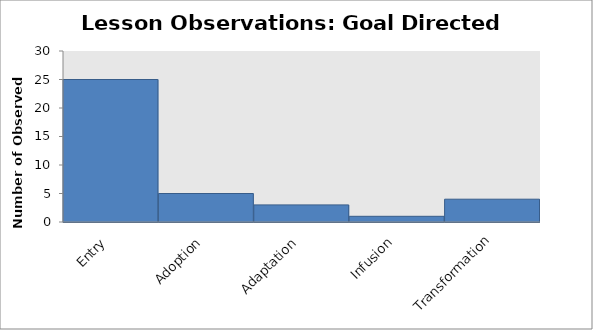
| Category | Lessons |
|---|---|
| Entry | 25 |
| Adoption | 5 |
| Adaptation | 3 |
| Infusion | 1 |
| Transformation | 4 |